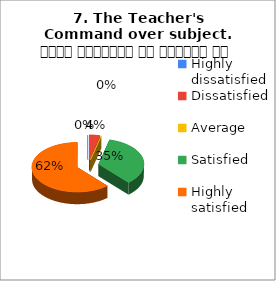
| Category | 7. The Teacher's Command over subject. विषय अवधारणा पर शिक्षक का ज्ञान |
|---|---|
| Highly dissatisfied | 0 |
| Dissatisfied | 1 |
| Average | 0 |
| Satisfied | 9 |
| Highly satisfied | 16 |